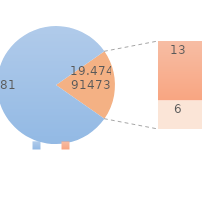
| Category | Series 0 |
|---|---|
|  | 81.055 |
|  | 13.173 |
|  | 6.302 |